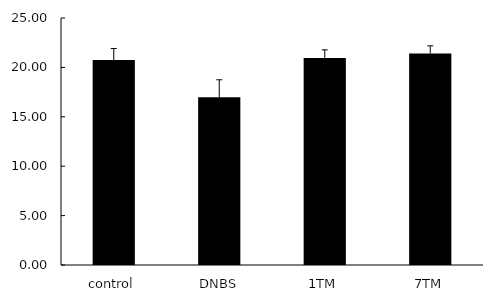
| Category | Series 0 |
|---|---|
| control | 20.744 |
| DNBS | 16.979 |
| 1TM | 20.953 |
| 7TM | 21.416 |